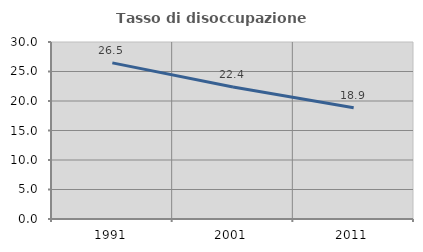
| Category | Tasso di disoccupazione giovanile  |
|---|---|
| 1991.0 | 26.459 |
| 2001.0 | 22.388 |
| 2011.0 | 18.852 |